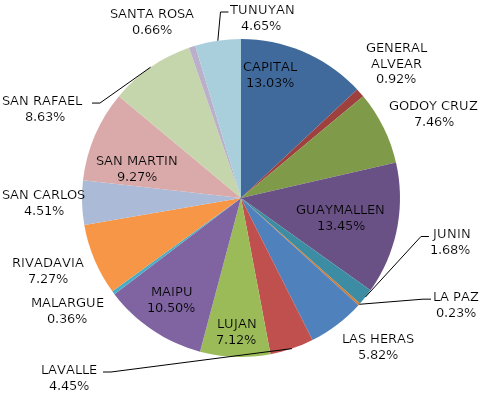
| Category | Total Otros Juegos Propios Recaudación  |
|---|---|
| CAPITAL | 631110 |
| GENERAL ALVEAR | 44700 |
| GODOY CRUZ | 361395 |
| GUAYMALLEN | 651305 |
| JUNIN | 81170 |
| LA PAZ | 10910 |
| LAS HERAS | 281785 |
| LAVALLE | 215355 |
| LUJAN | 344680 |
| MAIPU | 508675 |
| MALARGUE | 17345 |
| RIVADAVIA | 352055 |
| SAN CARLOS | 218435 |
| SAN MARTIN | 449165 |
| SAN RAFAEL  | 417715 |
| SANTA ROSA | 31820 |
| TUNUYAN | 225315 |